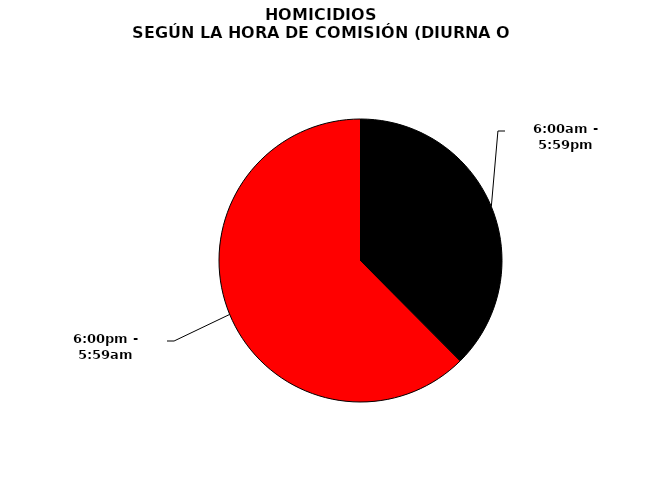
| Category | Series 0 |
|---|---|
| 6:00am - 5:59pm | 679 |
| 6:00pm - 5:59am | 1129 |